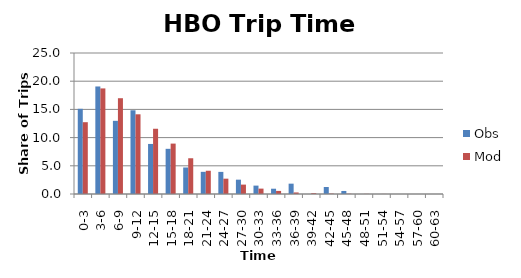
| Category | Obs | Mod |
|---|---|---|
| 0-3 | 15.108 | 12.73 |
| 3-6 | 19.066 | 18.721 |
| 6-9 | 12.974 | 16.982 |
| 9-12 | 14.844 | 14.131 |
| 12-15 | 8.874 | 11.568 |
| 15-18 | 8.01 | 8.937 |
| 18-21 | 4.7 | 6.338 |
| 21-24 | 3.929 | 4.122 |
| 24-27 | 3.921 | 2.717 |
| 27-30 | 2.541 | 1.665 |
| 30-33 | 1.487 | 0.954 |
| 33-36 | 0.937 | 0.545 |
| 36-39 | 1.833 | 0.275 |
| 39-42 | 0 | 0.148 |
| 42-45 | 1.238 | 0.075 |
| 45-48 | 0.539 | 0.047 |
| 48-51 | 0 | 0.023 |
| 51-54 | 0 | 0.013 |
| 54-57 | 0 | 0.005 |
| 57-60 | 0 | 0.002 |
| 60-63 | 0 | 0.001 |